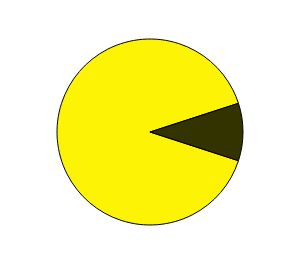
| Category | Series 0 |
|---|---|
| 0 | 1 |
| 1 | 9 |